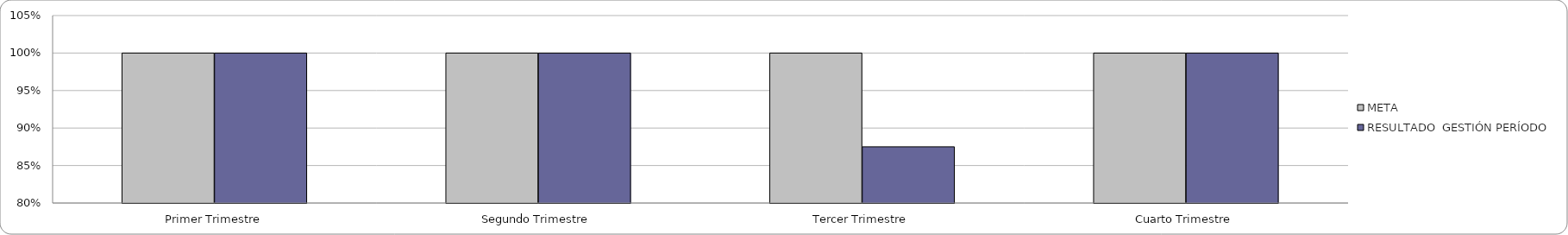
| Category | META | RESULTADO  GESTIÓN PERÍODO |
|---|---|---|
| Primer Trimestre | 1 | 1 |
| Segundo Trimestre | 1 | 1 |
| Tercer Trimestre | 1 | 0.875 |
| Cuarto Trimestre | 1 | 1 |